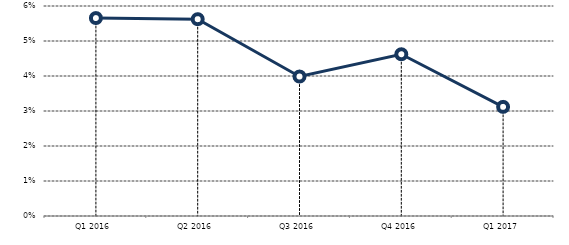
| Category | Series 0 |
|---|---|
| Q1 2016 | 0.057 |
| Q2 2016 | 0.056 |
| Q3 2016 | 0.04 |
| Q4 2016 | 0.046 |
| Q1 2017 | 0.031 |